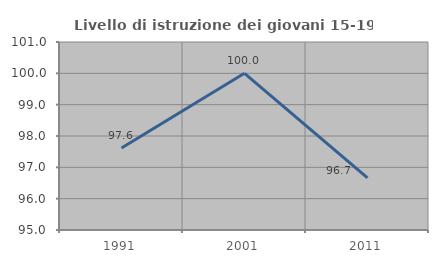
| Category | Livello di istruzione dei giovani 15-19 anni |
|---|---|
| 1991.0 | 97.619 |
| 2001.0 | 100 |
| 2011.0 | 96.667 |